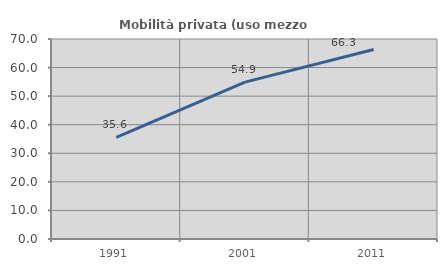
| Category | Mobilità privata (uso mezzo privato) |
|---|---|
| 1991.0 | 35.551 |
| 2001.0 | 54.898 |
| 2011.0 | 66.34 |